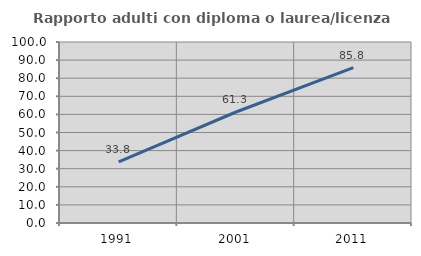
| Category | Rapporto adulti con diploma o laurea/licenza media  |
|---|---|
| 1991.0 | 33.803 |
| 2001.0 | 61.326 |
| 2011.0 | 85.792 |